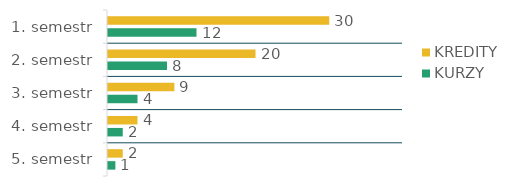
| Category | KREDITY  | KURZY  |
|---|---|---|
| 1. semestr | 30 | 12 |
| 2. semestr | 20 | 8 |
| 3. semestr | 9 | 4 |
| 4. semestr | 4 | 2 |
| 5. semestr | 2 | 1 |